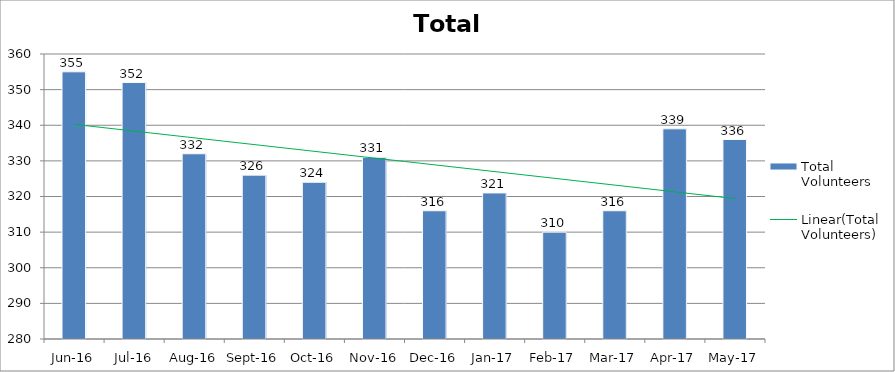
| Category | Total Volunteers |
|---|---|
| Jun-16 | 355 |
| Jul-16 | 352 |
| Aug-16 | 332 |
| Sep-16 | 326 |
| Oct-16 | 324 |
| Nov-16 | 331 |
| Dec-16 | 316 |
| Jan-17 | 321 |
| Feb-17 | 310 |
| Mar-17 | 316 |
| Apr-17 | 339 |
| May-17 | 336 |